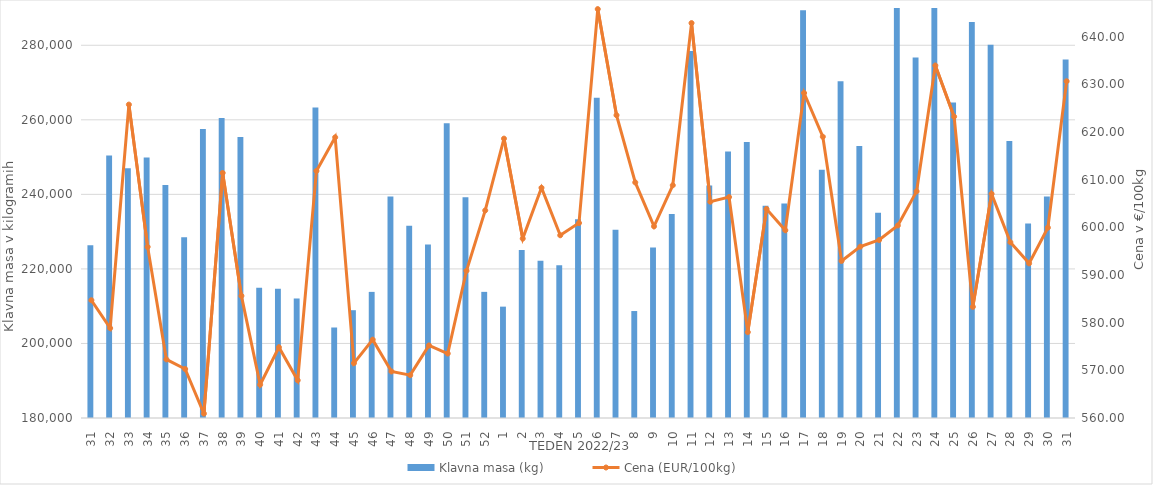
| Category | Klavna masa (kg) |
|---|---|
| 31.0 | 226322 |
| 32.0 | 250418 |
| 33.0 | 246996 |
| 34.0 | 249873 |
| 35.0 | 242516 |
| 36.0 | 228469 |
| 37.0 | 257511 |
| 38.0 | 260481 |
| 39.0 | 255370 |
| 40.0 | 214936 |
| 41.0 | 214672 |
| 42.0 | 212066 |
| 43.0 | 263287 |
| 44.0 | 204280 |
| 45.0 | 208920 |
| 46.0 | 213836 |
| 47.0 | 239417 |
| 48.0 | 231565 |
| 49.0 | 226575 |
| 50.0 | 259073 |
| 51.0 | 239211 |
| 52.0 | 213841 |
| 1.0 | 209877 |
| 2.0 | 225045 |
| 3.0 | 222198 |
| 4.0 | 221002 |
| 5.0 | 233306 |
| 6.0 | 265944 |
| 7.0 | 230531 |
| 8.0 | 208699 |
| 9.0 | 225712 |
| 10.0 | 234762 |
| 11.0 | 278467 |
| 12.0 | 242369 |
| 13.0 | 251507 |
| 14.0 | 254072 |
| 15.0 | 236964 |
| 16.0 | 237552 |
| 17.0 | 289400 |
| 18.0 | 246616 |
| 19.0 | 270374 |
| 20.0 | 252984 |
| 21.0 | 235060 |
| 22.0 | 290816 |
| 23.0 | 276702 |
| 24.0 | 292976 |
| 25.0 | 264669 |
| 26.0 | 286237 |
| 27.0 | 280112 |
| 28.0 | 254336 |
| 29.0 | 232178 |
| 30.0 | 239437 |
| 31.0 | 276163 |